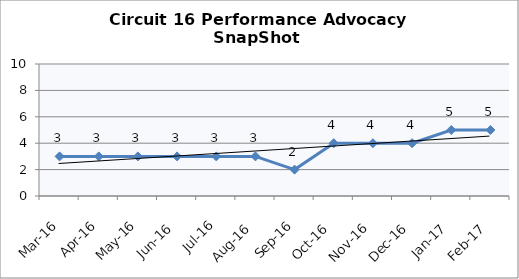
| Category | Circuit 16 |
|---|---|
| Mar-16 | 3 |
| Apr-16 | 3 |
| May-16 | 3 |
| Jun-16 | 3 |
| Jul-16 | 3 |
| Aug-16 | 3 |
| Sep-16 | 2 |
| Oct-16 | 4 |
| Nov-16 | 4 |
| Dec-16 | 4 |
| Jan-17 | 5 |
| Feb-17 | 5 |